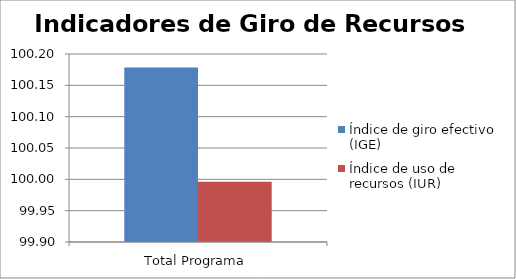
| Category | Índice de giro efectivo (IGE) | Índice de uso de recursos (IUR)  |
|---|---|---|
| Total Programa | 100.179 | 99.996 |